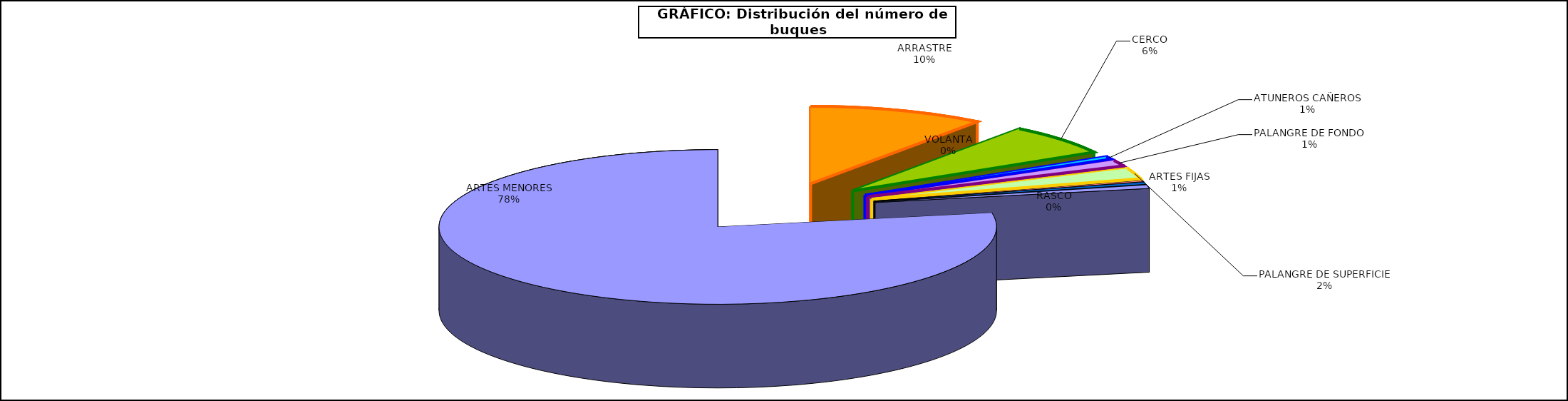
| Category | Series 0 |
|---|---|
| ARRASTRE | 906 |
| CERCO | 573 |
| ATUNEROS CAÑEROS | 53 |
| PALANGRE DE FONDO | 111 |
| PALANGRE DE SUPERFICIE | 199 |
| RASCO | 21 |
| VOLANTA | 40 |
| ARTES FIJAS | 60 |
| ARTES MENORES | 6921 |